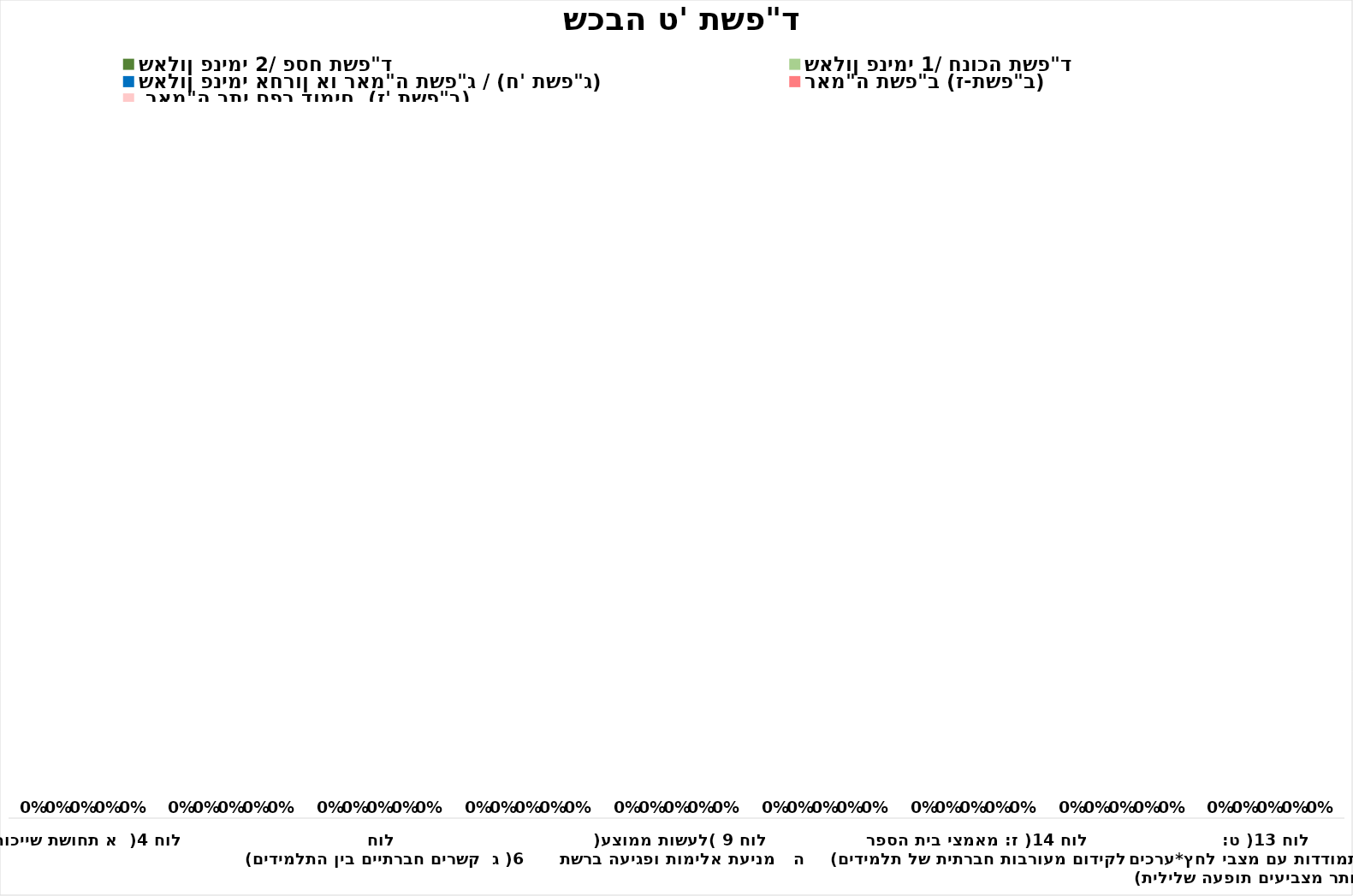
| Category | שאלון פנימי 2/ פסח תשפ"ד  | שאלון פנימי 1/ חנוכה תשפ"ד | שאלון פנימי אחרון או ראמ"ה תשפ"ג / (ח' תשפ"ג)  | ראמ"ה תשפ"ב (ז-תשפ"ב) |  ראמ"ה בתי ספר דומים  (ז' תשפ"ב)  |
|---|---|---|---|---|---|
| (לוח 4)  א תחושת שייכות | 0 | 0 | 0 | 0 | 0 |
| (לוח 5 ) ב:יחסי קרבה ואכפתיות בין מורים לתלמידים | 0 | 0 | 0 | 0 | 0 |
| (לוח 6) ג  קשרים חברתיים בין התלמידים | 0 | 0 | 0 | 0 | 0 |
| (לוח 7) ד   התנהגות לא נאותה של תלמידים בכיתה*  ערכים גבוהים יותר מצביעים תופעה שלילית   | 0 | 0 | 0 | 0 | 0 |
| לוח 9 (לעשות ממוצע) ה   מניעת אלימות ופגיעה ברשת | 0 | 0 | 0 | 0 | 0 |
| (לוח 8 ) ו מעורבות באירועי אלימות* ערכים גבוהים יותר מצביעים תופעה שלילית | 0 | 0 | 0 | 0 | 0 |
| (לוח 14) ז: מאמצי בית הספר לקידום מעורבות חברתית של תלמידים | 0 | 0 | 0 | 0 | 0 |
| (לוח 12) ח  מיומנויות רגשיות חברתיות  | 0 | 0 | 0 | 0 | 0 |
| (לוח 13) ט: קושי בהתמודדות עם מצבי לחץ*ערכים גבוהים יותר מצביעים תופעה שלילית   | 0 | 0 | 0 | 0 | 0 |